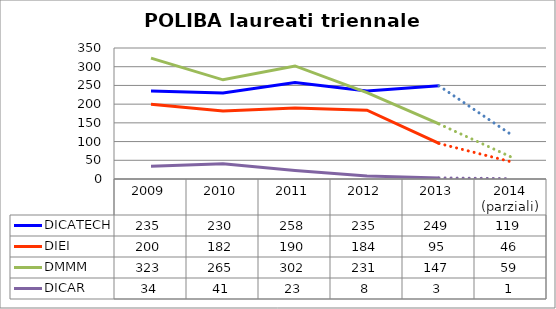
| Category | DICATECH | DIEI  | DMMM | DICAR |
|---|---|---|---|---|
| 2009 | 235 | 200 | 323 | 34 |
| 2010 | 230 | 182 | 265 | 41 |
| 2011 | 258 | 190 | 302 | 23 |
| 2012 | 235 | 184 | 231 | 8 |
| 2013 | 249 | 95 | 147 | 3 |
| 2014
(parziali) | 119 | 46 | 59 | 1 |